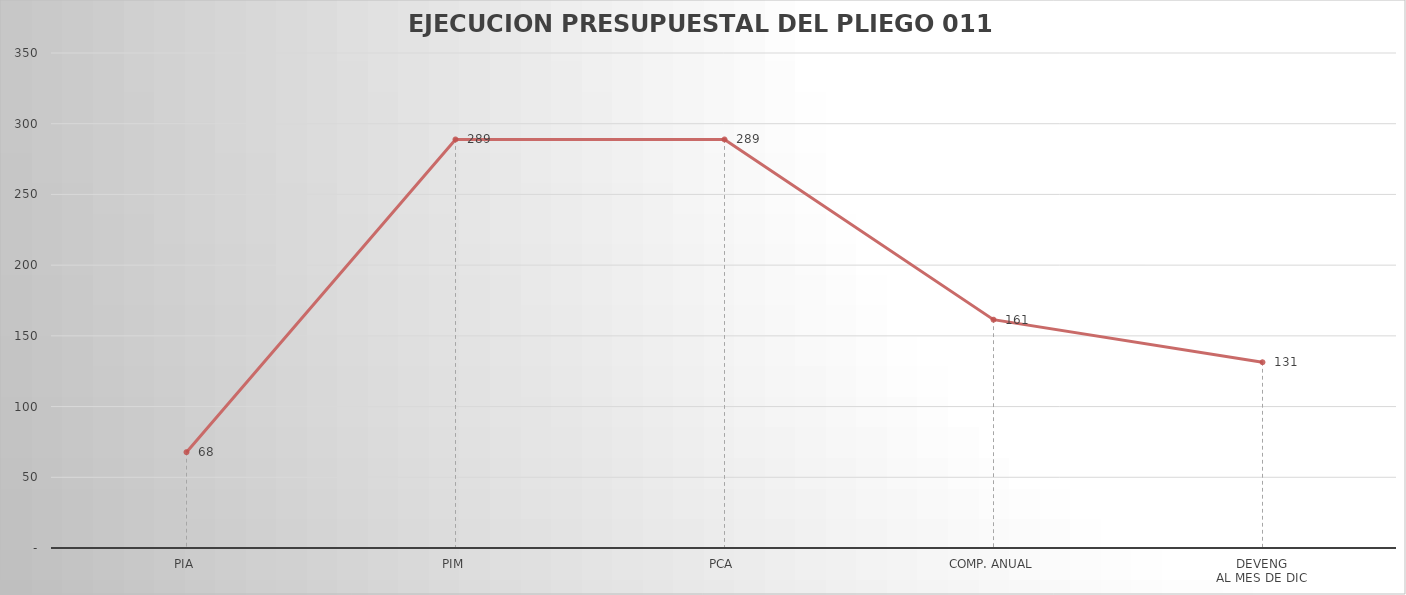
| Category | Series 0 |
|---|---|
| PIA | 67.768 |
| PIM | 288.87 |
| PCA | 288.87 |
| COMP. ANUAL | 161.447 |
| DEVENG
AL MES DE DIC | 131.336 |